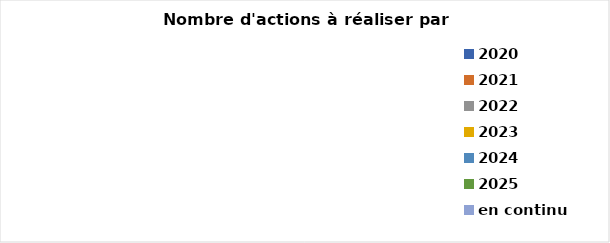
| Category | Nombre d'action à réaliser |
|---|---|
| 2020 | 0 |
| 2021 | 0 |
| 2022 | 0 |
| 2023 | 0 |
| 2024 | 0 |
| 2025 | 0 |
| en continu | 0 |